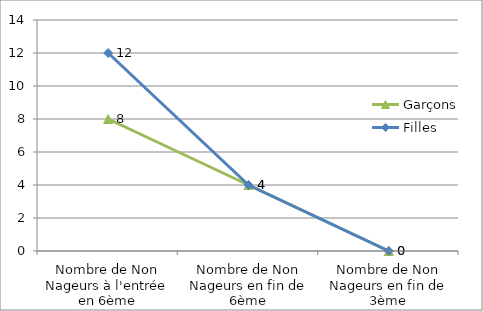
| Category | Garçons | Filles |
|---|---|---|
| Nombre de Non Nageurs à l'entrée en 6ème | 8 | 12 |
| Nombre de Non Nageurs en fin de 6ème | 4 | 4 |
| Nombre de Non Nageurs en fin de 3ème | 0 | 0 |